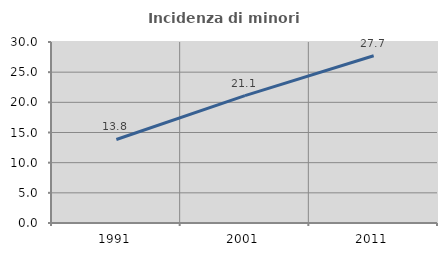
| Category | Incidenza di minori stranieri |
|---|---|
| 1991.0 | 13.846 |
| 2001.0 | 21.118 |
| 2011.0 | 27.718 |